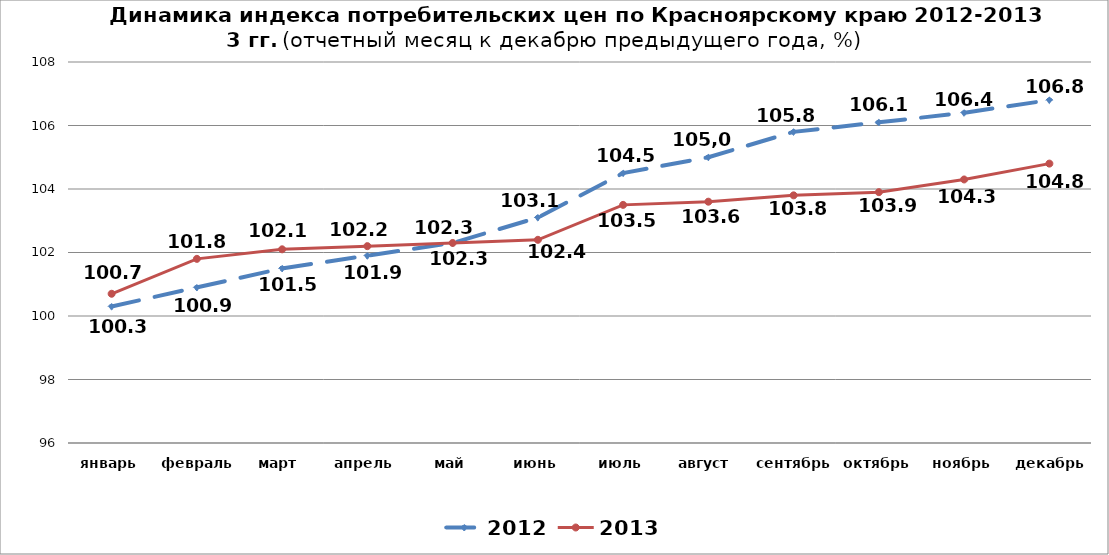
| Category | 2012 | 2013 |
|---|---|---|
| январь | 100.3 | 100.7 |
| февраль | 100.9 | 101.8 |
| март | 101.5 | 102.1 |
| апрель | 101.9 | 102.2 |
| май | 102.3 | 102.3 |
| июнь | 103.1 | 102.4 |
| июль | 104.5 | 103.5 |
| август | 105 | 103.6 |
| сентябрь | 105.8 | 103.8 |
| октябрь | 106.1 | 103.9 |
| ноябрь | 106.4 | 104.3 |
| декабрь | 106.8 | 104.8 |